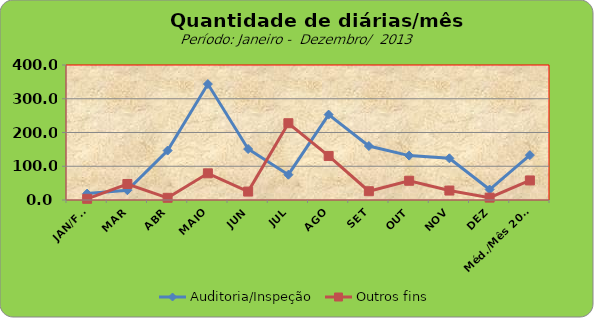
| Category | Auditoria/Inspeção | Outros fins |
|---|---|---|
| JAN/FEV | 19 | 3.5 |
| MAR | 29 | 47.5 |
| ABR | 146.5 | 6.5 |
| MAIO | 343.5 | 79 |
| JUN | 151 | 25 |
| JUL | 75 | 227.5 |
| AGO | 253 | 130.5 |
| SET | 160 | 26 |
| OUT | 131.5 | 57 |
| NOV | 123.5 | 28 |
| DEZ | 31 | 7 |
| Méd./Mês 2013 | 133 | 57.955 |